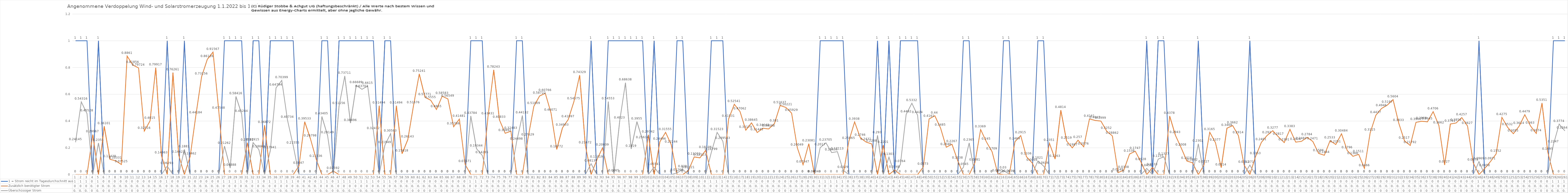
| Category | 1 = Strom reicht im Tagesdurchschnitt aus | Zusätzlich benötigter Strom | Überschüssiger Strom |
|---|---|---|---|
| 0 | 1 | 0 | 0.241 |
| 1 | 1 | 0 | 0.543 |
| 2 | 1 | 0 | 0.455 |
| 3 | 0 | 0.3 | 0 |
| 4 | 1 | 0 | 0.236 |
| 5 | 0 | 0.361 | 0 |
| 6 | 0 | 0.114 | 0 |
| 7 | 0 | 0.103 | 0 |
| 8 | 0 | 0.075 | 0 |
| 9 | 0 | 0.886 | 0 |
| 10 | 0 | 0.819 | 0 |
| 11 | 0 | 0.797 | 0 |
| 12 | 0 | 0.325 | 0 |
| 13 | 0 | 0.402 | 0 |
| 14 | 0 | 0.799 | 0 |
| 15 | 0 | 0.141 | 0 |
| 16 | 1 | 0 | 0.063 |
| 17 | 0 | 0.763 | 0 |
| 18 | 0 | 0.146 | 0 |
| 19 | 1 | 0 | 0.188 |
| 20 | 0 | 0.135 | 0 |
| 21 | 0 | 0.442 | 0 |
| 22 | 0 | 0.732 | 0 |
| 23 | 0 | 0.861 | 0 |
| 24 | 0 | 0.916 | 0 |
| 25 | 0 | 0.475 | 0 |
| 26 | 1 | 0 | 0.213 |
| 27 | 1 | 0 | 0.049 |
| 28 | 1 | 0 | 0.584 |
| 29 | 1 | 0 | 0.452 |
| 30 | 0 | 0.238 | 0 |
| 31 | 1 | 0 | 0.239 |
| 32 | 1 | 0 | 0.187 |
| 33 | 0 | 0.369 | 0 |
| 34 | 1 | 0 | 0.179 |
| 35 | 1 | 0 | 0.648 |
| 36 | 1 | 0 | 0.704 |
| 37 | 1 | 0 | 0.407 |
| 38 | 1 | 0 | 0.216 |
| 39 | 0 | 0.065 | 0 |
| 40 | 0 | 0.395 | 0 |
| 41 | 0 | 0.268 | 0 |
| 42 | 0 | 0.115 | 0 |
| 43 | 1 | 0 | 0.434 |
| 44 | 1 | 0 | 0.291 |
| 45 | 0 | 0.026 | 0 |
| 46 | 1 | 0 | 0.512 |
| 47 | 1 | 0 | 0.737 |
| 48 | 1 | 0 | 0.385 |
| 49 | 1 | 0 | 0.667 |
| 50 | 1 | 0 | 0.637 |
| 51 | 1 | 0 | 0.661 |
| 52 | 1 | 0 | 0.324 |
| 53 | 0 | 0.515 | 0 |
| 54 | 1 | 0 | 0.219 |
| 55 | 1 | 0 | 0.306 |
| 56 | 0 | 0.515 | 0 |
| 57 | 0 | 0.156 | 0 |
| 58 | 0 | 0.261 | 0 |
| 59 | 0 | 0.517 | 0 |
| 60 | 0 | 0.752 | 0 |
| 61 | 0 | 0.578 | 0 |
| 62 | 0 | 0.556 | 0 |
| 63 | 0 | 0.487 | 0 |
| 64 | 0 | 0.586 | 0 |
| 65 | 0 | 0.565 | 0 |
| 66 | 0 | 0.358 | 0 |
| 67 | 0 | 0.415 | 0 |
| 68 | 0 | 0.077 | 0 |
| 69 | 1 | 0 | 0.438 |
| 70 | 1 | 0 | 0.193 |
| 71 | 1 | 0 | 0.143 |
| 72 | 0 | 0.434 | 0 |
| 73 | 0 | 0.782 | 0 |
| 74 | 0 | 0.408 | 0 |
| 75 | 0 | 0.309 | 0 |
| 76 | 0 | 0.325 | 0 |
| 77 | 1 | 0 | 0.245 |
| 78 | 1 | 0 | 0.441 |
| 79 | 0 | 0.276 | 0 |
| 80 | 0 | 0.51 | 0 |
| 81 | 0 | 0.587 | 0 |
| 82 | 0 | 0.608 | 0 |
| 83 | 0 | 0.461 | 0 |
| 84 | 0 | 0.188 | 0 |
| 85 | 0 | 0.349 | 0 |
| 86 | 0 | 0.411 | 0 |
| 87 | 0 | 0.546 | 0 |
| 88 | 0 | 0.743 | 0 |
| 89 | 0 | 0.217 | 0 |
| 90 | 1 | 0 | 0.081 |
| 91 | 0 | 0.11 | 0 |
| 92 | 0 | 0.2 | 0 |
| 93 | 1 | 0 | 0.546 |
| 94 | 1 | 0 | 0.006 |
| 95 | 1 | 0 | 0.402 |
| 96 | 1 | 0 | 0.686 |
| 97 | 1 | 0 | 0.192 |
| 98 | 1 | 0 | 0.396 |
| 99 | 1 | 0 | 0.256 |
| 100 | 0 | 0.297 | 0 |
| 101 | 1 | 0 | 0.055 |
| 102 | 0 | 0.245 | 0 |
| 103 | 0 | 0.316 | 0 |
| 104 | 0 | 0.222 | 0 |
| 105 | 1 | 0 | 0.013 |
| 106 | 1 | 0 | 0.038 |
| 107 | 0 | 0.031 | 0 |
| 108 | 0 | 0.132 | 0 |
| 109 | 0 | 0.125 | 0 |
| 110 | 0 | 0.181 | 0 |
| 111 | 1 | 0 | 0.168 |
| 112 | 1 | 0 | 0.315 |
| 113 | 1 | 0 | 0.25 |
| 114 | 0 | 0.415 | 0 |
| 115 | 0 | 0.525 | 0 |
| 116 | 0 | 0.471 | 0 |
| 117 | 0 | 0.332 | 0 |
| 118 | 0 | 0.386 | 0 |
| 119 | 0 | 0.314 | 0 |
| 120 | 0 | 0.346 | 0 |
| 121 | 0 | 0.341 | 0 |
| 122 | 0 | 0.381 | 0 |
| 123 | 0 | 0.516 | 0 |
| 124 | 0 | 0.502 | 0 |
| 125 | 0 | 0.459 | 0 |
| 126 | 0 | 0.2 | 0 |
| 127 | 0 | 0.073 | 0 |
| 128 | 0 | 0.231 | 0 |
| 129 | 0 | 0 | 0 |
| 130 | 1 | 0 | 0.202 |
| 131 | 1 | 0 | 0.237 |
| 132 | 1 | 0 | 0.164 |
| 133 | 1 | 0 | 0.171 |
| 134 | 1 | 0 | 0.033 |
| 135 | 0 | 0.251 | 0 |
| 136 | 0 | 0.394 | 0 |
| 137 | 0 | 0.275 | 0 |
| 138 | 0 | 0.243 | 0 |
| 139 | 0 | 0.229 | 0 |
| 140 | 1 | 0 | 0.293 |
| 141 | 0 | 0.22 | 0 |
| 142 | 1 | 0 | 0.13 |
| 143 | 0 | 0.035 | 0 |
| 144 | 1 | 0 | 0.076 |
| 145 | 1 | 0 | 0.449 |
| 146 | 1 | 0 | 0.533 |
| 147 | 1 | 0 | 0.442 |
| 148 | 0 | 0.057 | 0 |
| 149 | 0 | 0.416 | 0 |
| 150 | 0 | 0.44 | 0 |
| 151 | 0 | 0.348 | 0 |
| 152 | 0 | 0.205 | 0 |
| 153 | 0 | 0.227 | 0 |
| 154 | 0 | 0.104 | 0 |
| 155 | 1 | 0 | 0.054 |
| 156 | 1 | 0 | 0.237 |
| 157 | 0 | 0.088 | 0 |
| 158 | 0 | 0.337 | 0 |
| 159 | 0 | 0.245 | 0 |
| 160 | 0 | 0.171 | 0 |
| 161 | 0 | 0.007 | 0 |
| 162 | 1 | 0 | 0.03 |
| 163 | 1 | 0 | 0.004 |
| 164 | 0 | 0.247 | 0 |
| 165 | 0 | 0.292 | 0 |
| 166 | 0 | 0.134 | 0 |
| 167 | 0 | 0.087 | 0 |
| 168 | 1 | 0 | 0.102 |
| 169 | 1 | 0 | 0.064 |
| 170 | 0 | 0.235 | 0 |
| 171 | 0 | 0.116 | 0 |
| 172 | 0 | 0.481 | 0 |
| 173 | 0 | 0.252 | 0 |
| 174 | 0 | 0.2 | 0 |
| 175 | 0 | 0.257 | 0 |
| 176 | 0 | 0.208 | 0 |
| 177 | 0 | 0.416 | 0 |
| 178 | 0 | 0.405 | 0 |
| 179 | 0 | 0.4 | 0 |
| 180 | 0 | 0.325 | 0 |
| 181 | 0 | 0.289 | 0 |
| 182 | 0 | 0.015 | 0 |
| 183 | 0 | 0.034 | 0 |
| 184 | 0 | 0.154 | 0 |
| 185 | 0 | 0.175 | 0 |
| 186 | 0 | 0.093 | 0 |
| 187 | 1 | 0 | 0.046 |
| 188 | 0 | 0.053 | 0 |
| 189 | 1 | 0 | 0.115 |
| 190 | 1 | 0 | 0.133 |
| 191 | 0 | 0.438 | 0 |
| 192 | 0 | 0.294 | 0 |
| 193 | 0 | 0.201 | 0 |
| 194 | 0 | 0.102 | 0 |
| 195 | 0 | 0.088 | 0 |
| 196 | 1 | 0 | 0.23 |
| 197 | 0 | 0.073 | 0 |
| 198 | 0 | 0.316 | 0 |
| 199 | 0 | 0.238 | 0 |
| 200 | 0 | 0.051 | 0 |
| 201 | 0 | 0.347 | 0 |
| 202 | 0 | 0.366 | 0 |
| 203 | 0 | 0.291 | 0 |
| 204 | 0 | 0.071 | 0 |
| 205 | 1 | 0 | 0.071 |
| 206 | 0 | 0.135 | 0 |
| 207 | 0 | 0.24 | 0 |
| 208 | 0 | 0.292 | 0 |
| 209 | 0 | 0.328 | 0 |
| 210 | 0 | 0.282 | 0 |
| 211 | 0 | 0.239 | 0 |
| 212 | 0 | 0.338 | 0 |
| 213 | 0 | 0.243 | 0 |
| 214 | 0 | 0.248 | 0 |
| 215 | 0 | 0.278 | 0 |
| 216 | 0 | 0.247 | 0 |
| 217 | 0 | 0.159 | 0 |
| 218 | 0 | 0.144 | 0 |
| 219 | 0 | 0.253 | 0 |
| 220 | 0 | 0.225 | 0 |
| 221 | 0 | 0.305 | 0 |
| 222 | 0 | 0.18 | 0 |
| 223 | 0 | 0.137 | 0 |
| 224 | 0 | 0.151 | 0 |
| 225 | 0 | 0.047 | 0 |
| 226 | 0 | 0.311 | 0 |
| 227 | 0 | 0.444 | 0 |
| 228 | 0 | 0.495 | 0 |
| 229 | 0 | 0.52 | 0 |
| 230 | 0 | 0.56 | 0 |
| 231 | 0 | 0.383 | 0 |
| 232 | 0 | 0.252 | 0 |
| 233 | 0 | 0.218 | 0 |
| 234 | 0 | 0.391 | 0 |
| 235 | 0 | 0.399 | 0 |
| 236 | 0 | 0.394 | 0 |
| 237 | 0 | 0.471 | 0 |
| 238 | 0 | 0.366 | 0 |
| 239 | 0 | 0.073 | 0 |
| 240 | 0 | 0.378 | 0 |
| 241 | 0 | 0.386 | 0 |
| 242 | 0 | 0.426 | 0 |
| 243 | 0 | 0.363 | 0 |
| 244 | 0 | 0.088 | 0 |
| 245 | 1 | 0 | 0.097 |
| 246 | 0 | 0.046 | 0 |
| 247 | 0 | 0.097 | 0 |
| 248 | 0 | 0.155 | 0 |
| 249 | 0 | 0.428 | 0 |
| 250 | 0 | 0.353 | 0 |
| 251 | 0 | 0.305 | 0 |
| 252 | 0 | 0.361 | 0 |
| 253 | 0 | 0.448 | 0 |
| 254 | 0 | 0.363 | 0 |
| 255 | 0 | 0.307 | 0 |
| 256 | 0 | 0.535 | 0 |
| 257 | 0 | 0.169 | 0 |
| 258 | 1 | 0 | 0.225 |
| 259 | 1 | 0 | 0.377 |
| 260 | 1 | 0 | 0.326 |